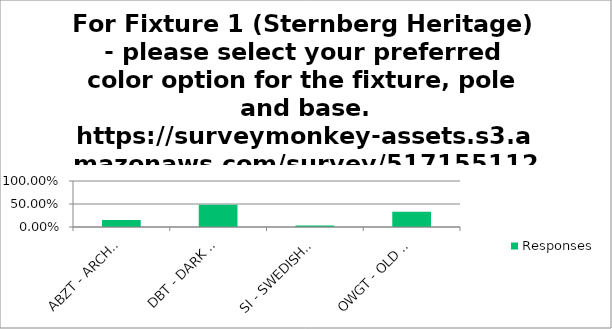
| Category | Responses |
|---|---|
| ABZT - ARCHITECTURAL MEDIUM BRONZE | 0.152 |
| DBT - DARK BRONZE TEXTURED | 0.485 |
| SI - SWEDISH IRON | 0.03 |
| OWGT - OLD WORLD GRAY TEXTURED | 0.333 |